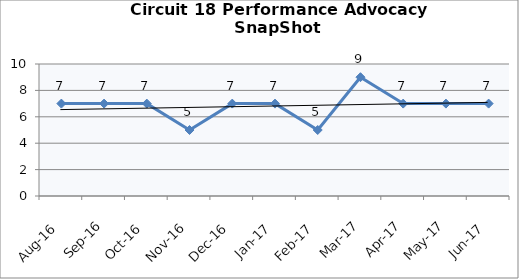
| Category | Circuit 18 |
|---|---|
| Aug-16 | 7 |
| Sep-16 | 7 |
| Oct-16 | 7 |
| Nov-16 | 5 |
| Dec-16 | 7 |
| Jan-17 | 7 |
| Feb-17 | 5 |
| Mar-17 | 9 |
| Apr-17 | 7 |
| May-17 | 7 |
| Jun-17 | 7 |